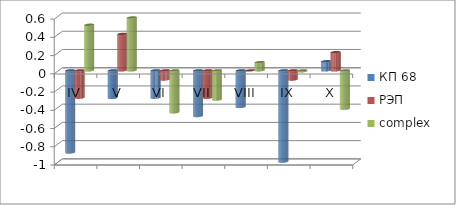
| Category | КП 68 | РЭП  | complex |
|---|---|---|---|
| IV | -0.9 | -0.3 | 0.5 |
| V | -0.3 | 0.4 | 0.58 |
| VI | -0.3 | -0.1 | -0.46 |
| VII | -0.5 | -0.3 | -0.32 |
| VIII | -0.4 | 0 | 0.09 |
| IX | -1 | -0.1 | -0.01 |
| X | 0.1 | 0.2 | -0.42 |